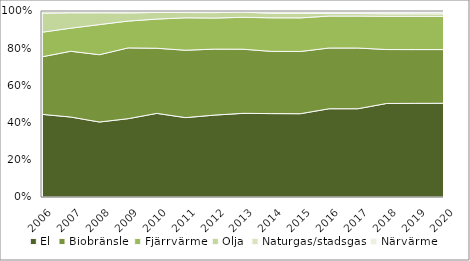
| Category | El | Biobränsle | Fjärrvärme | Olja | Naturgas/stadsgas | Närvärme |
|---|---|---|---|---|---|---|
| 2006 | 0.447 | 0.311 | 0.133 | 0.103 | 0.009 | 0.003 |
| 2007 | 0.43 | 0.354 | 0.124 | 0.083 | 0.006 | 0.003 |
| 2008 | 0.403 | 0.362 | 0.162 | 0.063 | 0.006 | 0.003 |
| 2009 | 0.421 | 0.381 | 0.144 | 0.044 | 0.006 | 0.004 |
| 2010 | 0.45 | 0.35 | 0.157 | 0.036 | 0.006 | 0.002 |
| 2011 | 0.427 | 0.362 | 0.174 | 0.028 | 0.004 | 0.005 |
| 2012 | 0.44 | 0.355 | 0.167 | 0.029 | 0.005 | 0.004 |
| 2013 | 0.45 | 0.345 | 0.172 | 0.028 | 0.003 | 0.003 |
| 2014 | 0.448 | 0.335 | 0.18 | 0.024 | 0.008 | 0.005 |
| 2015 | 0.448 | 0.335 | 0.181 | 0.024 | 0.008 | 0.005 |
| 2016 | 0.475 | 0.326 | 0.172 | 0.013 | 0.008 | 0.006 |
| 2017 | 0.475 | 0.326 | 0.172 | 0.013 | 0.008 | 0.006 |
| 2018 | 0.503 | 0.29 | 0.179 | 0.013 | 0.009 | 0.007 |
| 2019 | 0.503 | 0.289 | 0.179 | 0.013 | 0.009 | 0.007 |
| 2020 | 0.504 | 0.289 | 0.179 | 0.013 | 0.009 | 0.007 |